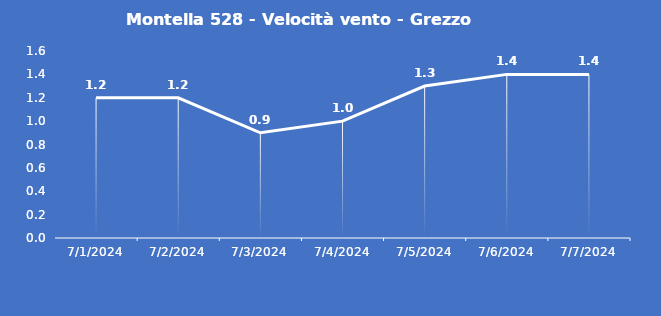
| Category | Montella 528 - Velocità vento - Grezzo (m/s) |
|---|---|
| 7/1/24 | 1.2 |
| 7/2/24 | 1.2 |
| 7/3/24 | 0.9 |
| 7/4/24 | 1 |
| 7/5/24 | 1.3 |
| 7/6/24 | 1.4 |
| 7/7/24 | 1.4 |